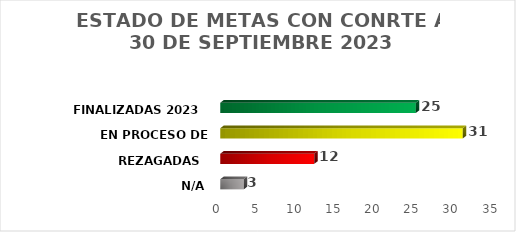
| Category | Series 0 |
|---|---|
| N/A | 3 |
| REZAGADAS  | 12 |
| EN PROCESO DE DESARROLLO  | 31 |
| FINALIZADAS 2023  | 25 |